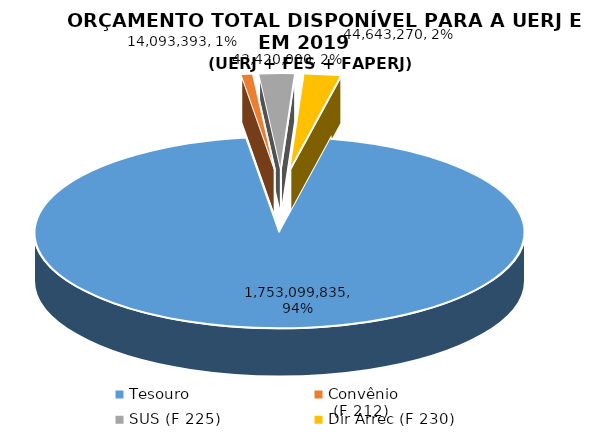
| Category | Series 0 |
|---|---|
| Tesouro | 1753099835 |
| Convênio
 (F 212) | 14093393 |
| SUS (F 225) | 43420000 |
| Dir Arrec (F 230) | 44643270 |